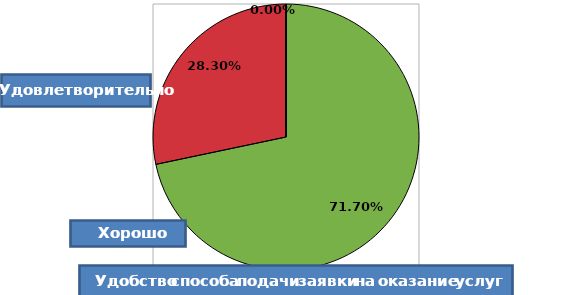
| Category | Series 0 |
|---|---|
| 0 | 0.717 |
| 1 | 0.283 |
| 2 | 0 |